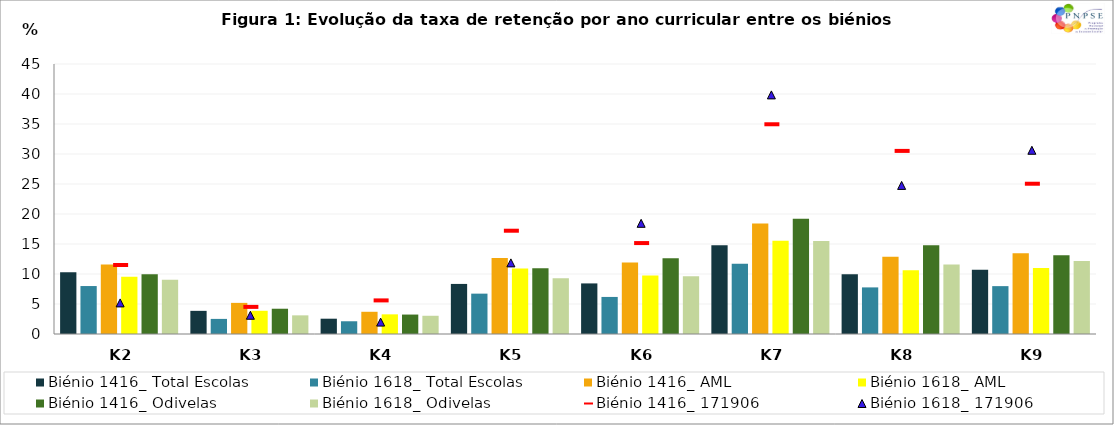
| Category | Biénio 1416_ | Biénio 1618_ |
|---|---|---|
| K2 | 9.965 | 9.06 |
| K3 | 4.212 | 3.108 |
| K4 | 3.24 | 3.037 |
| K5 | 10.946 | 9.303 |
| K6 | 12.64 | 9.617 |
| K7 | 19.22 | 15.513 |
| K8 | 14.777 | 11.568 |
| K9 | 13.115 | 12.165 |